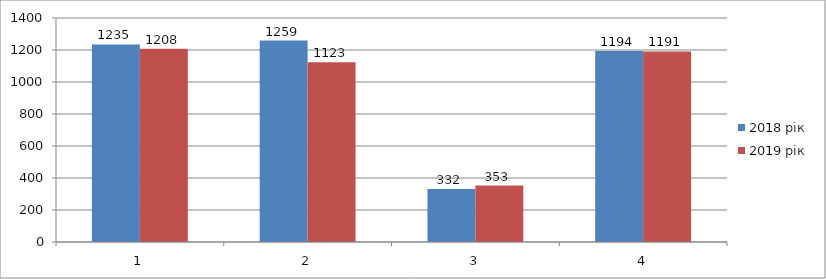
| Category | 2018 рік | 2019 рік |
|---|---|---|
| 0 | 1235 | 1208 |
| 1 | 1259 | 1123 |
| 2 | 332 | 353 |
| 3 | 1194 | 1191 |